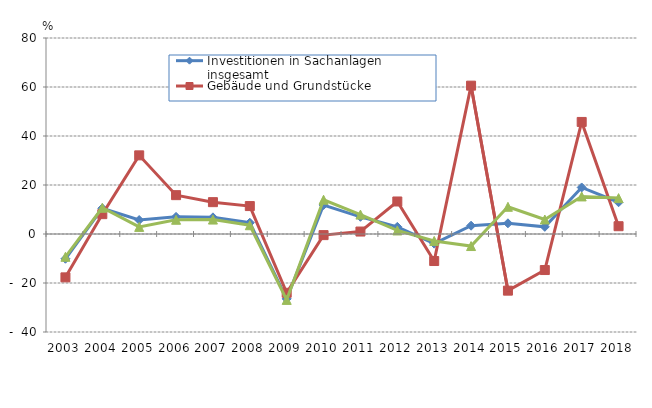
| Category | Investitionen in Sachanlagen insgesamt | Gebäude und Grundstücke | Maschinen und Betriebsausstattung |
|---|---|---|---|
| 2003.0 | -10.1 | -17.7 | -9.3 |
| 2004.0 | 10.5 | 8.1 | 10.7 |
| 2005.0 | 5.7 | 32.1 | 2.9 |
| 2006.0 | 6.991 | 15.857 | 5.812 |
| 2007.0 | 6.796 | 13.004 | 5.891 |
| 2008.0 | 4.6 | 11.4 | 3.579 |
| 2009.0 | -26.476 | -23.99 | -26.892 |
| 2010.0 | 11.843 | -0.455 | 13.982 |
| 2011.0 | 7.019 | 1.003 | 7.933 |
| 2012.0 | 2.918 | 13.273 | 1.446 |
| 2013.0 | -3.946 | -11.028 | -2.822 |
| 2014.0 | 3.39 | 60.554 | -4.916 |
| 2015.0 | 4.363 | -23.122 | 11.106 |
| 2016.0 | 2.923 | -14.713 | 5.917 |
| 2017.0 | 18.993 | 45.739 | 15.337 |
| 2018.0 | 12.959 | 3.178 | 14.649 |